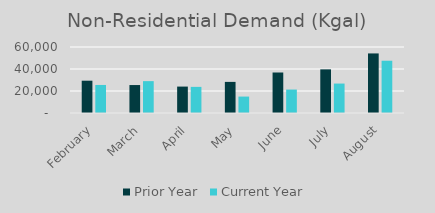
| Category | Prior Year | Current Year |
|---|---|---|
| February | 29366 | 25488 |
| March | 25412 | 28967 |
| April | 24018 | 23746 |
| May | 28279 | 14933 |
| June | 36817 | 21309 |
| July | 39671 | 26764 |
| August | 54156 | 47522 |